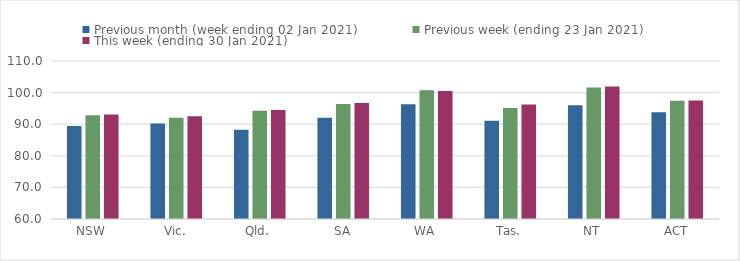
| Category | Previous month (week ending 02 Jan 2021) | Previous week (ending 23 Jan 2021) | This week (ending 30 Jan 2021) |
|---|---|---|---|
| NSW | 89.4 | 92.86 | 93.07 |
| Vic. | 90.19 | 92.03 | 92.52 |
| Qld. | 88.28 | 94.23 | 94.46 |
| SA | 92.06 | 96.42 | 96.71 |
| WA | 96.3 | 100.73 | 100.51 |
| Tas. | 91.1 | 95.16 | 96.2 |
| NT | 95.98 | 101.58 | 101.95 |
| ACT | 93.77 | 97.39 | 97.53 |